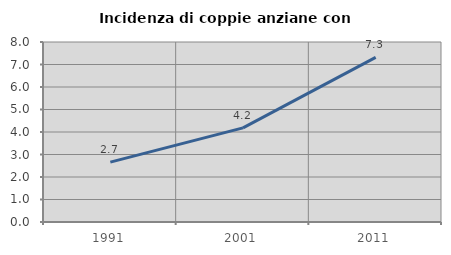
| Category | Incidenza di coppie anziane con figli |
|---|---|
| 1991.0 | 2.662 |
| 2001.0 | 4.184 |
| 2011.0 | 7.317 |